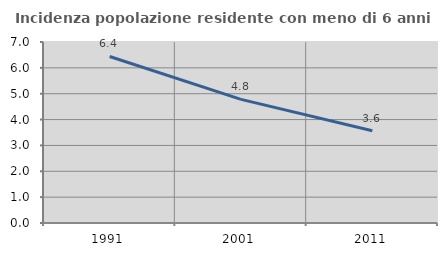
| Category | Incidenza popolazione residente con meno di 6 anni |
|---|---|
| 1991.0 | 6.439 |
| 2001.0 | 4.78 |
| 2011.0 | 3.57 |